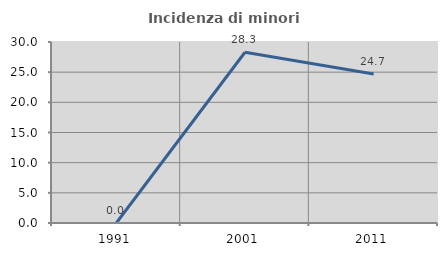
| Category | Incidenza di minori stranieri |
|---|---|
| 1991.0 | 0 |
| 2001.0 | 28.302 |
| 2011.0 | 24.713 |